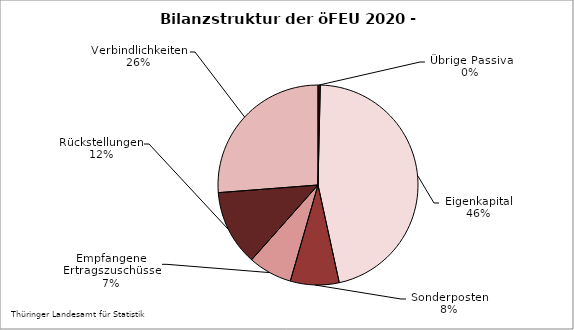
| Category | Series 0 |
|---|---|
| Übrige Passiva, Rechnungsab-grenzungsposten | 0.37 |
| Eigenkapital | 46.217 |
| SoPo mit Rücklageanteil, aus Zuwendungen und anderweitig nicht genannt | 7.875 |
| Empfangene Ertragszuschüsse | 7.089 |
| Rückstellungen | 12.226 |
| Verbindlichkeiten | 26.223 |